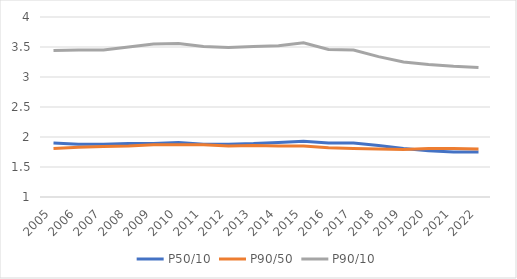
| Category | P50/10 | P90/50 | P90/10 |
|---|---|---|---|
| 2005.0 | 1.9 | 1.81 | 3.44 |
| 2006.0 | 1.88 | 1.83 | 3.45 |
| 2007.0 | 1.88 | 1.84 | 3.45 |
| 2008.0 | 1.89 | 1.85 | 3.5 |
| 2009.0 | 1.89 | 1.87 | 3.55 |
| 2010.0 | 1.91 | 1.87 | 3.56 |
| 2011.0 | 1.88 | 1.87 | 3.51 |
| 2012.0 | 1.88 | 1.85 | 3.49 |
| 2013.0 | 1.89 | 1.86 | 3.51 |
| 2014.0 | 1.91 | 1.85 | 3.52 |
| 2015.0 | 1.93 | 1.85 | 3.57 |
| 2016.0 | 1.9 | 1.82 | 3.46 |
| 2017.0 | 1.9 | 1.81 | 3.45 |
| 2018.0 | 1.86 | 1.8 | 3.34 |
| 2019.0 | 1.81 | 1.79 | 3.25 |
| 2020.0 | 1.77 | 1.81 | 3.21 |
| 2021.0 | 1.75 | 1.81 | 3.18 |
| 2022.0 | 1.75 | 1.8 | 3.16 |